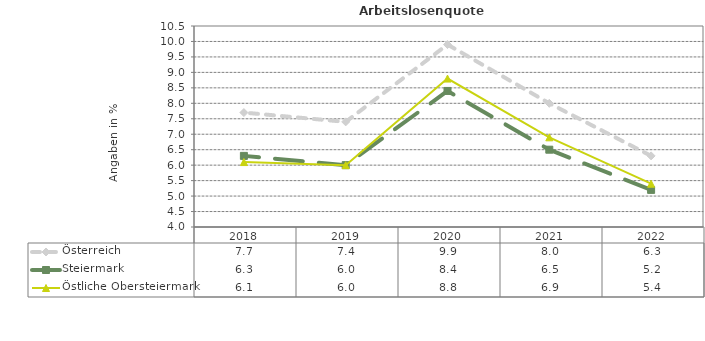
| Category | Österreich | Steiermark | Östliche Obersteiermark |
|---|---|---|---|
| 2022.0 | 6.3 | 5.2 | 5.4 |
| 2021.0 | 8 | 6.5 | 6.9 |
| 2020.0 | 9.9 | 8.4 | 8.8 |
| 2019.0 | 7.4 | 6 | 6 |
| 2018.0 | 7.7 | 6.3 | 6.1 |